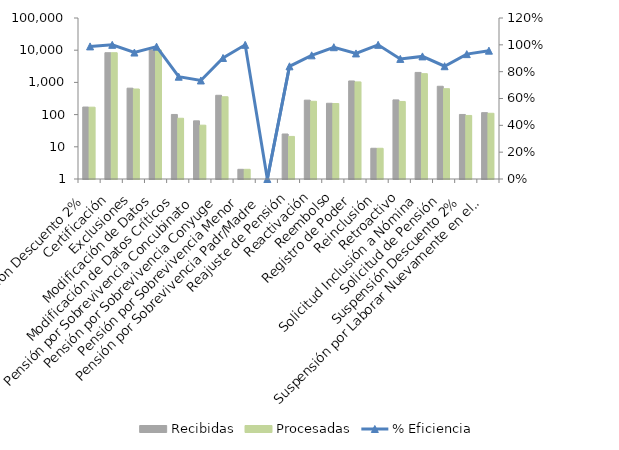
| Category | Recibidas | Procesadas |
|---|---|---|
| Aplicación Descuento 2% | 172 | 170 |
| Certificación  | 8355 | 8355 |
| Exclusiones | 662 | 624 |
| Modificación de Datos | 10240 | 10102 |
| Modificación de Datos Críticos | 101 | 77 |
| Pensión por Sobrevivencia Concubinato | 64 | 47 |
| Pensión por Sobrevivencia Conyuge | 398 | 359 |
| Pensión por Sobrevivencia Menor | 2 | 2 |
| Pensión por Sobrevivencia Padr/Madre | 0 | 0 |
| Reajuste de Pensión | 25 | 21 |
| Reactivación | 281 | 259 |
| Reembolso | 225 | 221 |
| Registro de Poder | 1108 | 1037 |
| Reinclusión | 9 | 9 |
| Retroactivo | 286 | 256 |
| Solicitud Inclusión a Nómina | 2043 | 1867 |
| Solicitud de Pensión | 759 | 638 |
| Suspensión Descuento 2% | 101 | 94 |
| Suspensión por Laborar Nuevamente en el Estado | 115 | 110 |